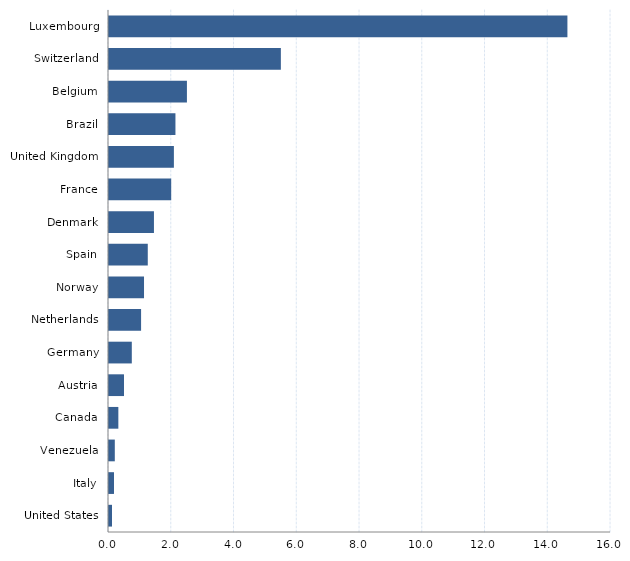
| Category | Series 0 |
|---|---|
| United States | 0.096 |
| Italy | 0.159 |
| Venezuela | 0.185 |
| Canada | 0.298 |
| Austria | 0.477 |
| Germany | 0.727 |
| Netherlands | 1.023 |
| Norway | 1.116 |
| Spain | 1.236 |
| Denmark | 1.433 |
| France | 1.982 |
| United Kingdom | 2.068 |
| Brazil | 2.118 |
| Belgium | 2.484 |
| Switzerland | 5.478 |
| Luxembourg | 14.611 |